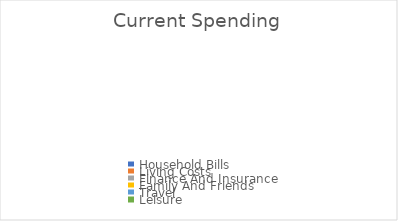
| Category | Series 0 |
|---|---|
| Household Bills | 0 |
| Living Costs | 0 |
| Finance And Insurance | 0 |
| Family And Friends | 0 |
| Travel | 0 |
| Leisure | 0 |